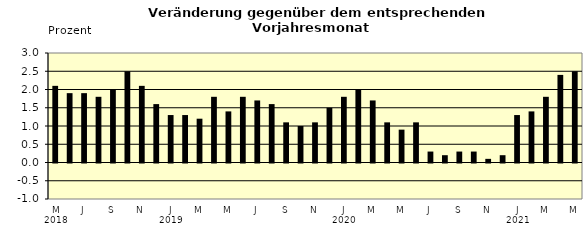
| Category | Series 0 |
|---|---|
| 0 | 2.1 |
| 1 | 1.9 |
| 2 | 1.9 |
| 3 | 1.8 |
| 4 | 2 |
| 5 | 2.5 |
| 6 | 2.1 |
| 7 | 1.6 |
| 8 | 1.3 |
| 9 | 1.3 |
| 10 | 1.2 |
| 11 | 1.8 |
| 12 | 1.4 |
| 13 | 1.8 |
| 14 | 1.7 |
| 15 | 1.6 |
| 16 | 1.1 |
| 17 | 1 |
| 18 | 1.1 |
| 19 | 1.5 |
| 20 | 1.8 |
| 21 | 2 |
| 22 | 1.7 |
| 23 | 1.1 |
| 24 | 0.9 |
| 25 | 1.1 |
| 26 | 0.3 |
| 27 | 0.2 |
| 28 | 0.3 |
| 29 | 0.3 |
| 30 | 0.1 |
| 31 | 0.2 |
| 32 | 1.3 |
| 33 | 1.4 |
| 34 | 1.8 |
| 35 | 2.4 |
| 36 | 2.5 |